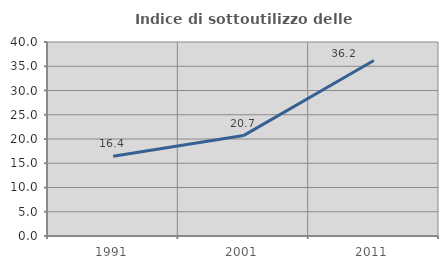
| Category | Indice di sottoutilizzo delle abitazioni  |
|---|---|
| 1991.0 | 16.438 |
| 2001.0 | 20.703 |
| 2011.0 | 36.189 |